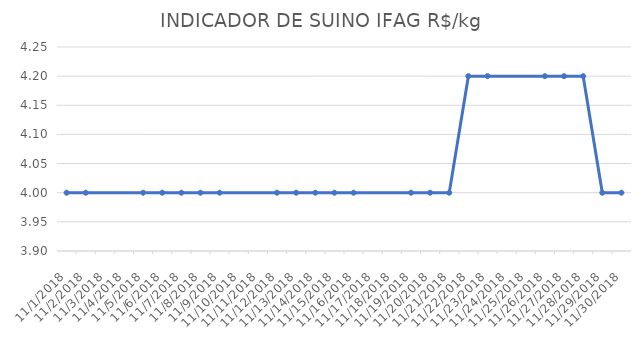
| Category | INDICADOR DE SUINO IFAG |
|---|---|
| 11/1/18 | 4 |
| 11/2/18 | 4 |
| 11/5/18 | 4 |
| 11/6/18 | 4 |
| 11/7/18 | 4 |
| 11/8/18 | 4 |
| 11/9/18 | 4 |
| 11/12/18 | 4 |
| 11/13/18 | 4 |
| 11/14/18 | 4 |
| 11/15/18 | 4 |
| 11/16/18 | 4 |
| 11/19/18 | 4 |
| 11/20/18 | 4 |
| 11/21/18 | 4 |
| 11/22/18 | 4.2 |
| 11/23/18 | 4.2 |
| 11/26/18 | 4.2 |
| 11/27/18 | 4.2 |
| 11/28/18 | 4.2 |
| 11/29/18 | 4 |
| 11/30/18 | 4 |